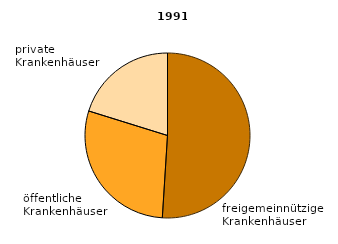
| Category | Series 0 |
|---|---|
| freigemeinnützige Krankenhäuser  | 51 |
| öffentliche Krankenhäuser  | 28.8 |
| private Krankenhäuser  | 20.2 |